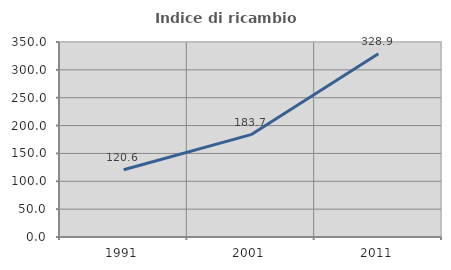
| Category | Indice di ricambio occupazionale  |
|---|---|
| 1991.0 | 120.588 |
| 2001.0 | 183.721 |
| 2011.0 | 328.947 |